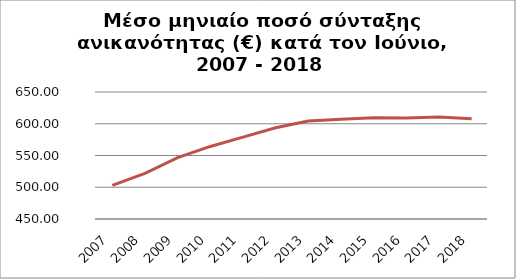
| Category | Series 1 |
|---|---|
| 2007.0 | 502.814 |
| 2008.0 | 521.879 |
| 2009.0 | 546.531 |
| 2010.0 | 564.26 |
| 2011.0 | 578.914 |
| 2012.0 | 593.581 |
| 2013.0 | 604.194 |
| 2014.0 | 607.259 |
| 2015.0 | 609.599 |
| 2016.0 | 609.16 |
| 2017.0 | 610.67 |
| 2018.0 | 607.87 |